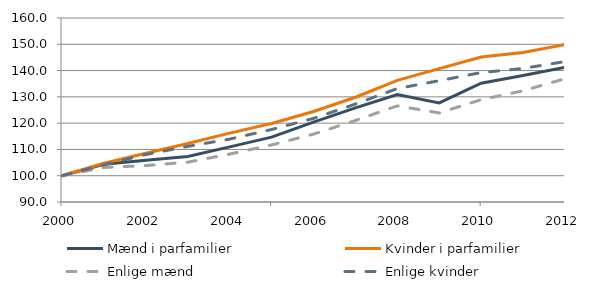
| Category | Mænd i parfamilier | Kvinder i parfamilier | Enlige mænd | Enlige kvinder |
|---|---|---|---|---|
| 2000.0 | 100 | 100 | 100 | 100 |
| 2001.0 | 104.346 | 104.726 | 103.133 | 104.112 |
| 2002.0 | 105.901 | 108.533 | 103.857 | 108.062 |
| 2003.0 | 107.315 | 112.238 | 105.155 | 111.165 |
| 2004.0 | 110.977 | 116.217 | 108.223 | 113.926 |
| 2005.0 | 114.685 | 119.841 | 111.713 | 117.585 |
| 2006.0 | 120.42 | 124.43 | 115.818 | 121.8 |
| 2007.0 | 125.783 | 129.855 | 121.016 | 127.256 |
| 2008.0 | 130.882 | 136.262 | 126.584 | 133.162 |
| 2009.0 | 127.692 | 140.758 | 123.885 | 136.157 |
| 2010.0 | 135.174 | 145.147 | 128.929 | 139.242 |
| 2011.0 | 138.13 | 146.913 | 132.308 | 140.803 |
| 2012.0 | 141.233 | 149.87 | 136.922 | 143.434 |